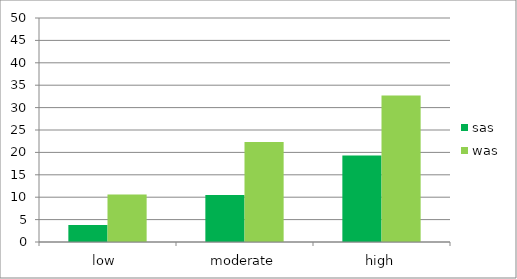
| Category | sas | was |
|---|---|---|
| low  | 3.8 | 10.6 |
| moderate | 10.5 | 22.3 |
| high | 19.3 | 32.7 |